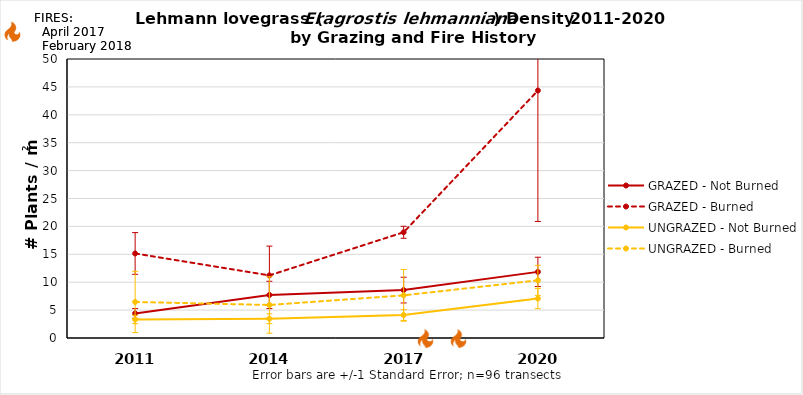
| Category | GRAZED - Not Burned | GRAZED - Burned | UNGRAZED - Not Burned | UNGRAZED - Burned |
|---|---|---|---|---|
| 2011.0 | 4.394 | 15.15 | 3.329 | 6.458 |
| 2014.0 | 7.715 | 11.221 | 3.461 | 5.92 |
| 2017.0 | 8.582 | 18.944 | 4.111 | 7.642 |
| 2020.0 | 11.851 | 44.347 | 7.077 | 10.333 |